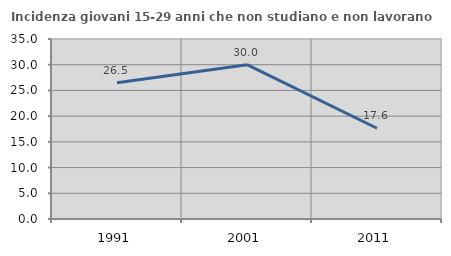
| Category | Incidenza giovani 15-29 anni che non studiano e non lavorano  |
|---|---|
| 1991.0 | 26.507 |
| 2001.0 | 30 |
| 2011.0 | 17.647 |